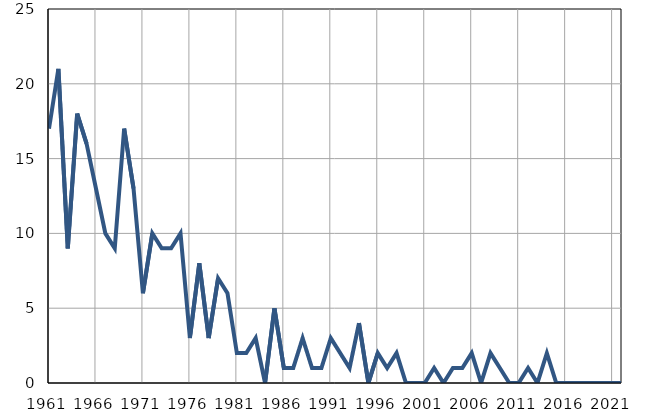
| Category | Умрла 
одојчад |
|---|---|
| 1961.0 | 17 |
| 1962.0 | 21 |
| 1963.0 | 9 |
| 1964.0 | 18 |
| 1965.0 | 16 |
| 1966.0 | 13 |
| 1967.0 | 10 |
| 1968.0 | 9 |
| 1969.0 | 17 |
| 1970.0 | 13 |
| 1971.0 | 6 |
| 1972.0 | 10 |
| 1973.0 | 9 |
| 1974.0 | 9 |
| 1975.0 | 10 |
| 1976.0 | 3 |
| 1977.0 | 8 |
| 1978.0 | 3 |
| 1979.0 | 7 |
| 1980.0 | 6 |
| 1981.0 | 2 |
| 1982.0 | 2 |
| 1983.0 | 3 |
| 1984.0 | 0 |
| 1985.0 | 5 |
| 1986.0 | 1 |
| 1987.0 | 1 |
| 1988.0 | 3 |
| 1989.0 | 1 |
| 1990.0 | 1 |
| 1991.0 | 3 |
| 1992.0 | 2 |
| 1993.0 | 1 |
| 1994.0 | 4 |
| 1995.0 | 0 |
| 1996.0 | 2 |
| 1997.0 | 1 |
| 1998.0 | 2 |
| 1999.0 | 0 |
| 2000.0 | 0 |
| 2001.0 | 0 |
| 2002.0 | 1 |
| 2003.0 | 0 |
| 2004.0 | 1 |
| 2005.0 | 1 |
| 2006.0 | 2 |
| 2007.0 | 0 |
| 2008.0 | 2 |
| 2009.0 | 1 |
| 2010.0 | 0 |
| 2011.0 | 0 |
| 2012.0 | 1 |
| 2013.0 | 0 |
| 2014.0 | 2 |
| 2015.0 | 0 |
| 2016.0 | 0 |
| 2017.0 | 0 |
| 2018.0 | 0 |
| 2019.0 | 0 |
| 2020.0 | 0 |
| 2021.0 | 0 |
| 2022.0 | 0 |